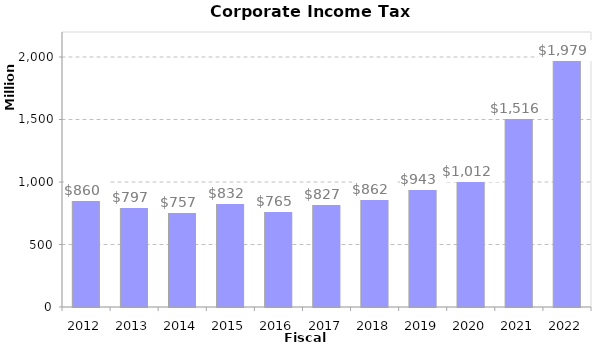
| Category | Amount |
|---|---|
| 2012.0 | 859922839.55 |
| 2013.0 | 796728154.4 |
| 2014.0 | 757490742.09 |
| 2015.0 | 831906887.16 |
| 2016.0 | 764948013.77 |
| 2017.0 | 826960822.31 |
| 2018.0 | 861897138.18 |
| 2019.0 | 943390660.95 |
| 2020.0 | 1011649618.07 |
| 2021.0 | 1515692110.65 |
| 2022.0 | 1978697205.29 |